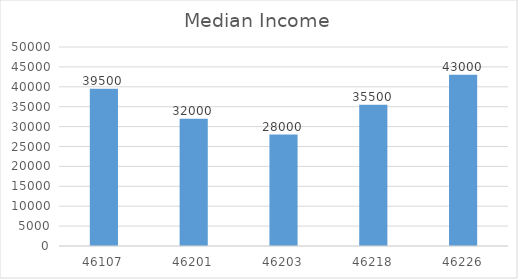
| Category | Median Income |
|---|---|
| 46107.0 | 39500 |
| 46201.0 | 32000 |
| 46203.0 | 28000 |
| 46218.0 | 35500 |
| 46226.0 | 43000 |